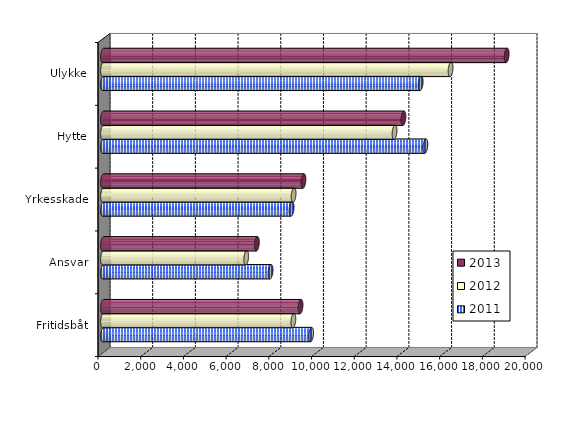
| Category | 2011 | 2012 | 2013 |
|---|---|---|---|
| Fritidsbåt | 9746.991 | 8915 | 9251 |
| Ansvar | 7847.124 | 6707 | 7206 |
| Yrkesskade | 8831.747 | 8926 | 9389 |
| Hytte | 15098.097 | 13654 | 14071 |
| Ulykke | 14876.983 | 16278 | 18904 |